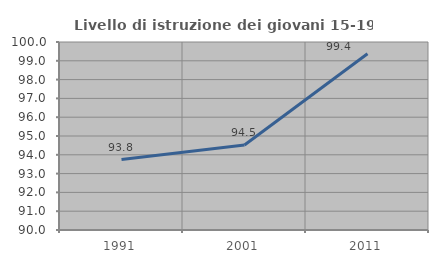
| Category | Livello di istruzione dei giovani 15-19 anni |
|---|---|
| 1991.0 | 93.75 |
| 2001.0 | 94.521 |
| 2011.0 | 99.371 |